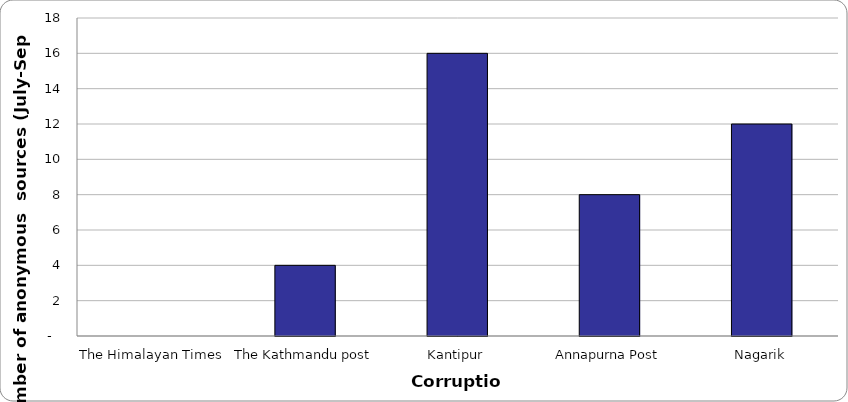
| Category | Corruption |
|---|---|
| The Himalayan Times | 0 |
| The Kathmandu post | 4 |
| Kantipur | 16 |
| Annapurna Post | 8 |
| Nagarik | 12 |